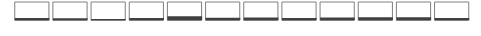
| Category | Dummy100Pct | Series 0 |
|---|---|---|
| 0 |  | 0.107 |
| 1 |  | 0.093 |
| 2 |  | 0.054 |
| 3 |  | 0.107 |
| 4 |  | 0.213 |
| 5 |  | 0.13 |
| 6 |  | 0.132 |
| 7 |  | 0.108 |
| 8 |  | 0.133 |
| 9 |  | 0.152 |
| 10 |  | 0.147 |
| 11 |  | 0.111 |